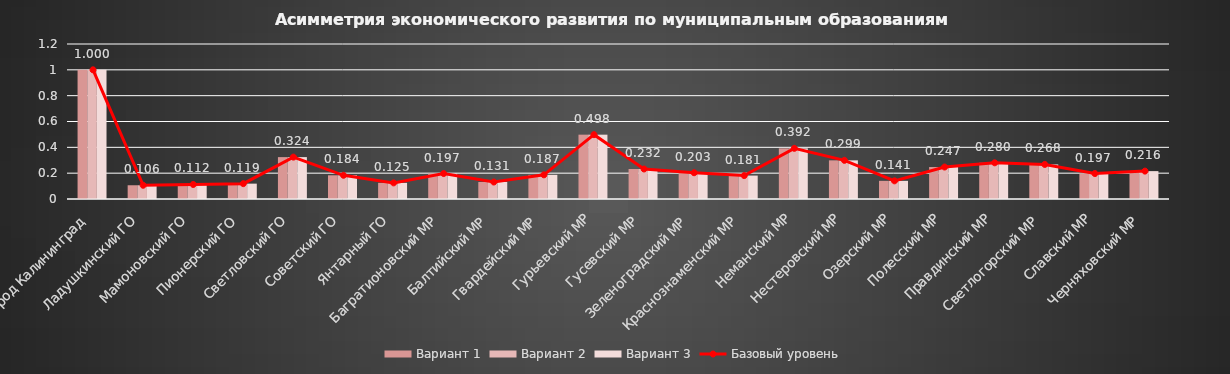
| Category | Вариант 1 | Вариант 2 | Вариант 3 |
|---|---|---|---|
| Город Калининград | 1 | 1 | 1 |
| Ладушкинский ГО | 0.106 | 0.106 | 0.106 |
| Мамоновский ГО | 0.112 | 0.112 | 0.112 |
| Пионерский ГО | 0.119 | 0.119 | 0.119 |
| Светловский ГО | 0.324 | 0.324 | 0.324 |
| Советский ГО | 0.184 | 0.184 | 0.184 |
| Янтарный ГО | 0.125 | 0.125 | 0.125 |
| Багратионовский МР | 0.197 | 0.197 | 0.197 |
| Балтийский МР | 0.131 | 0.131 | 0.131 |
| Гвардейский МР | 0.187 | 0.187 | 0.187 |
| Гурьевский МР | 0.498 | 0.498 | 0.498 |
| Гусевский МР | 0.232 | 0.232 | 0.232 |
| Зеленоградский МР | 0.203 | 0.203 | 0.203 |
| Краснознаменский МР | 0.181 | 0.181 | 0.181 |
| Неманский МР | 0.392 | 0.392 | 0.392 |
| Нестеровский МР | 0.299 | 0.299 | 0.299 |
| Озерский МР | 0.141 | 0.141 | 0.141 |
| Полесский МР | 0.247 | 0.247 | 0.247 |
| Правдинский МР | 0.28 | 0.28 | 0.28 |
| Светлогорский МР | 0.268 | 0.268 | 0.268 |
| Славский МР | 0.197 | 0.197 | 0.197 |
| Черняховский МР | 0.216 | 0.216 | 0.216 |